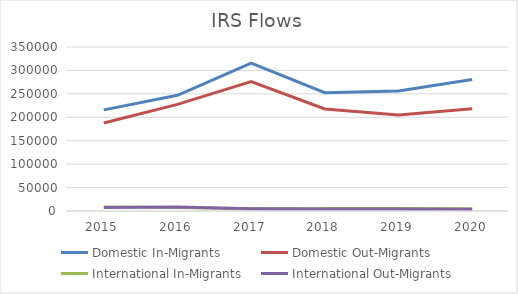
| Category | Domestic In-Migrants | Domestic Out-Migrants | International In-Migrants | International Out-Migrants |
|---|---|---|---|---|
| 2015.0 | 215858 | 187832 | 8444 | 7490 |
| 2016.0 | 246864 | 227450 | 7712 | 8438 |
| 2017.0 | 315539 | 276115 | 4918 | 5052 |
| 2018.0 | 252595 | 217682 | 5109 | 4251 |
| 2019.0 | 256355 | 204996 | 5223 | 4062 |
| 2020.0 | 280783 | 218116 | 4871 | 3930 |